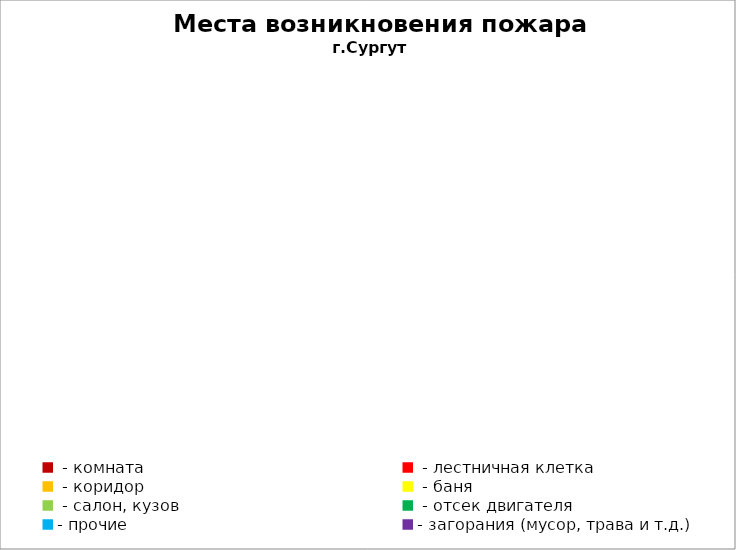
| Category | Места возникновения пожара |
|---|---|
|  - комната | 32 |
|  - лестничная клетка | 5 |
|  - коридор | 7 |
|  - баня | 9 |
|  - салон, кузов | 16 |
|  - отсек двигателя | 29 |
| - прочие | 101 |
| - загорания (мусор, трава и т.д.)  | 90 |